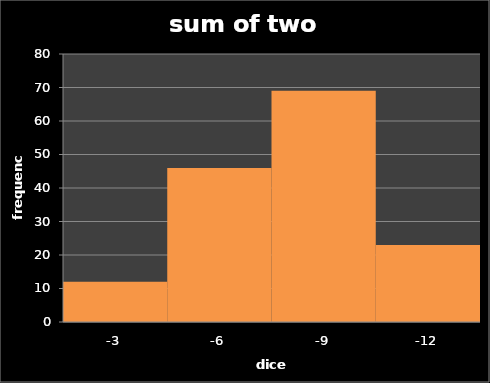
| Category | freq1 |
|---|---|
| -3.0 | 12 |
| -6.0 | 46 |
| -9.0 | 69 |
| -12.0 | 23 |